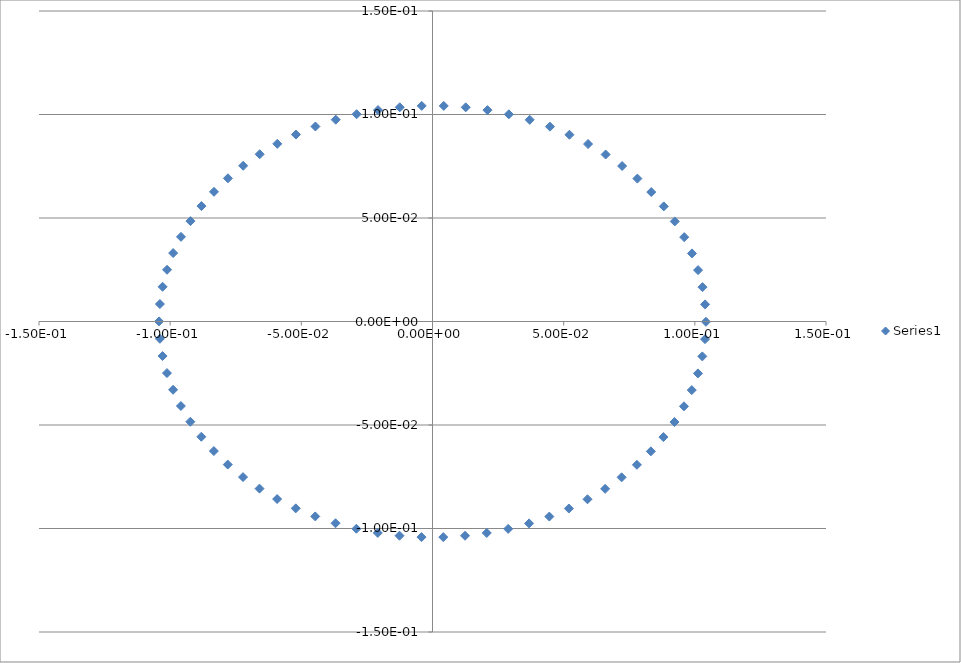
| Category | Series 0 |
|---|---|
| 0.0206843466 | -0.102 |
| 0.0288405083 | -0.1 |
| 0.0123939672 | -0.104 |
| 0.0368095264 | -0.098 |
| 0.0445396975 | -0.094 |
| 0.0519808531 | -0.09 |
| 0.0590847135 | -0.086 |
| 0.0658051819 | -0.081 |
| 0.07209865 | -0.075 |
| 0.0779242814 | -0.069 |
| 0.0832442641 | -0.063 |
| 0.0880240947 | -0.056 |
| 0.0922327489 | -0.049 |
| 0.0958429277 | -0.041 |
| 0.0988311842 | -0.033 |
| 0.101178139 | -0.025 |
| 0.102868564 | -0.017 |
| 0.103891492 | -0.009 |
| 0.104240283 | 0 |
| 0.103912674 | 0.008 |
| 0.102910787 | 0.017 |
| 0.101241134 | 0.025 |
| 0.0989145339 | 0.033 |
| 0.0959460959 | 0.041 |
| 0.0923550725 | 0.048 |
| 0.0881647766 | 0.056 |
| 0.0834023952 | 0.063 |
| 0.0780988187 | 0.069 |
| 0.0722884685 | 0.075 |
| 0.0660090595 | 0.081 |
| 0.0593013167 | 0.086 |
| 0.0522087812 | 0.09 |
| 0.0447774716 | 0.094 |
| 0.0370556042 | 0.097 |
| 0.0290932916 | 0.1 |
| 0.0209421962 | 0.102 |
| 0.0126552088 | 0.103 |
| 0.00428610342 | 0.104 |
| -0.00411081361 | 0.104 |
| -0.0124810562 | 0.103 |
| -0.0207703114 | 0.102 |
| -0.0289247893 | 0.1 |
| -0.0368915796 | 0.097 |
| -0.0446189865 | 0.094 |
| -0.0520568676 | 0.09 |
| -0.0591569617 | 0.086 |
| -0.0658731908 | 0.081 |
| -0.0721619725 | 0.075 |
| -0.0779825151 | 0.069 |
| -0.0832970366 | 0.063 |
| -0.0880710557 | 0.056 |
| -0.0922735929 | 0.048 |
| -0.0958773792 | 0.041 |
| -0.0988590345 | 0.033 |
| -0.10119921 | 0.025 |
| -0.102882713 | 0.017 |
| -0.10389863 | 0.008 |
| -0.104240358 | 0 |
| -0.103905685 | -0.008 |
| -0.102896787 | -0.017 |
| -0.101220205 | -0.025 |
| -0.0988868177 | -0.033 |
| -0.0959117711 | -0.041 |
| -0.0923143625 | -0.048 |
| -0.0881179422 | -0.056 |
| -0.083349742 | -0.063 |
| -0.0780406892 | -0.069 |
| -0.0722252503 | -0.075 |
| -0.0659411475 | -0.081 |
| -0.0592291579 | -0.086 |
| -0.0521328449 | -0.09 |
| -0.0446982458 | -0.094 |
| -0.0369736068 | -0.097 |
| -0.0290090516 | -0.1 |
| -0.0208562613 | -0.102 |
| -0.0125681367 | -0.103 |
| -0.00419845991 | -0.104 |
| 0.00411095191 | -0.104 |